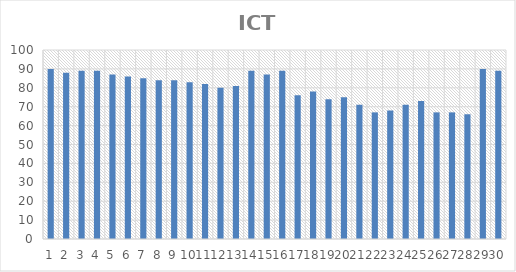
| Category | ICT |
|---|---|
| 0 | 90 |
| 1 | 88 |
| 2 | 89 |
| 3 | 89 |
| 4 | 87 |
| 5 | 86 |
| 6 | 85 |
| 7 | 84 |
| 8 | 84 |
| 9 | 83 |
| 10 | 82 |
| 11 | 80 |
| 12 | 81 |
| 13 | 89 |
| 14 | 87 |
| 15 | 89 |
| 16 | 76 |
| 17 | 78 |
| 18 | 74 |
| 19 | 75 |
| 20 | 71 |
| 21 | 67 |
| 22 | 68 |
| 23 | 71 |
| 24 | 73 |
| 25 | 67 |
| 26 | 67 |
| 27 | 66 |
| 28 | 90 |
| 29 | 89 |